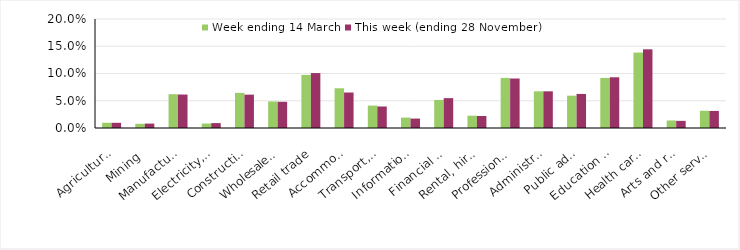
| Category | Week ending 14 March | This week (ending 28 November) |
|---|---|---|
| Agriculture, forestry and fishing | 0.01 | 0.01 |
| Mining | 0.008 | 0.008 |
| Manufacturing | 0.062 | 0.061 |
| Electricity, gas, water and waste services | 0.008 | 0.009 |
| Construction | 0.064 | 0.061 |
| Wholesale trade | 0.049 | 0.048 |
| Retail trade | 0.097 | 0.101 |
| Accommodation and food services | 0.073 | 0.065 |
| Transport, postal and warehousing | 0.041 | 0.04 |
| Information media and telecommunications | 0.019 | 0.017 |
| Financial and insurance services | 0.052 | 0.055 |
| Rental, hiring and real estate services | 0.023 | 0.022 |
| Professional, scientific and technical services | 0.092 | 0.091 |
| Administrative and support services | 0.067 | 0.067 |
| Public administration and safety | 0.059 | 0.062 |
| Education and training | 0.092 | 0.093 |
| Health care and social assistance | 0.138 | 0.144 |
| Arts and recreation services | 0.014 | 0.013 |
| Other services | 0.032 | 0.031 |